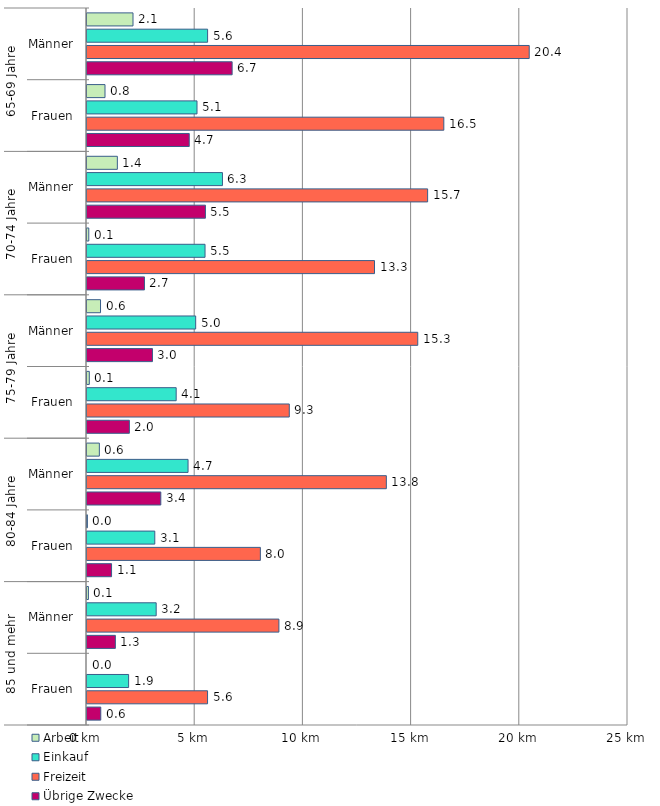
| Category | Arbeit | Einkauf | Freizeit | Übrige Zwecke |
|---|---|---|---|---|
| 0 | 2.126 | 5.573 | 20.436 | 6.707 |
| 1 | 0.832 | 5.083 | 16.489 | 4.725 |
| 2 | 1.402 | 6.259 | 15.741 | 5.473 |
| 3 | 0.083 | 5.454 | 13.286 | 2.656 |
| 4 | 0.625 | 5.022 | 15.285 | 3.025 |
| 5 | 0.106 | 4.121 | 9.348 | 1.959 |
| 6 | 0.571 | 4.67 | 13.833 | 3.411 |
| 7 | 0.018 | 3.132 | 8.011 | 1.134 |
| 8 | 0.066 | 3.197 | 8.869 | 1.311 |
| 9 | 0 | 1.923 | 5.571 | 0.636 |